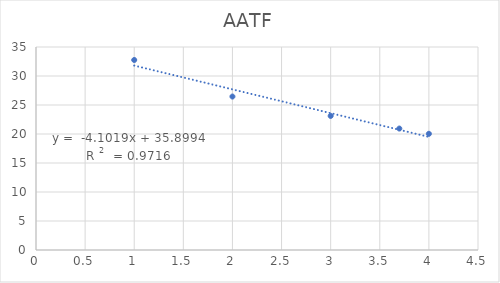
| Category | Series 0 |
|---|---|
| 4.0 | 20.033 |
| 3.6989700043360187 | 20.938 |
| 3.0 | 23.115 |
| 2.0 | 26.459 |
| 1.0 | 32.761 |